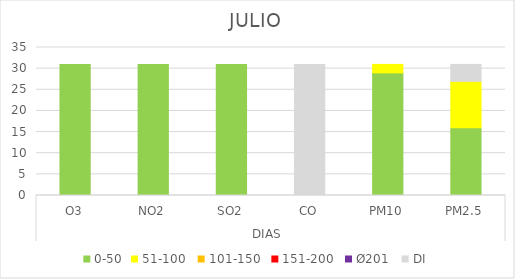
| Category | 0-50 | 51-100  | 101-150  | 151-200  | Ø201  | DI |
|---|---|---|---|---|---|---|
| 0 | 31 | 0 | 0 | 0 | 0 | 0 |
| 1 | 31 | 0 | 0 | 0 | 0 | 0 |
| 2 | 31 | 0 | 0 | 0 | 0 | 0 |
| 3 | 0 | 0 | 0 | 0 | 0 | 31 |
| 4 | 29 | 2 | 0 | 0 | 0 | 0 |
| 5 | 16 | 11 | 0 | 0 | 0 | 4 |